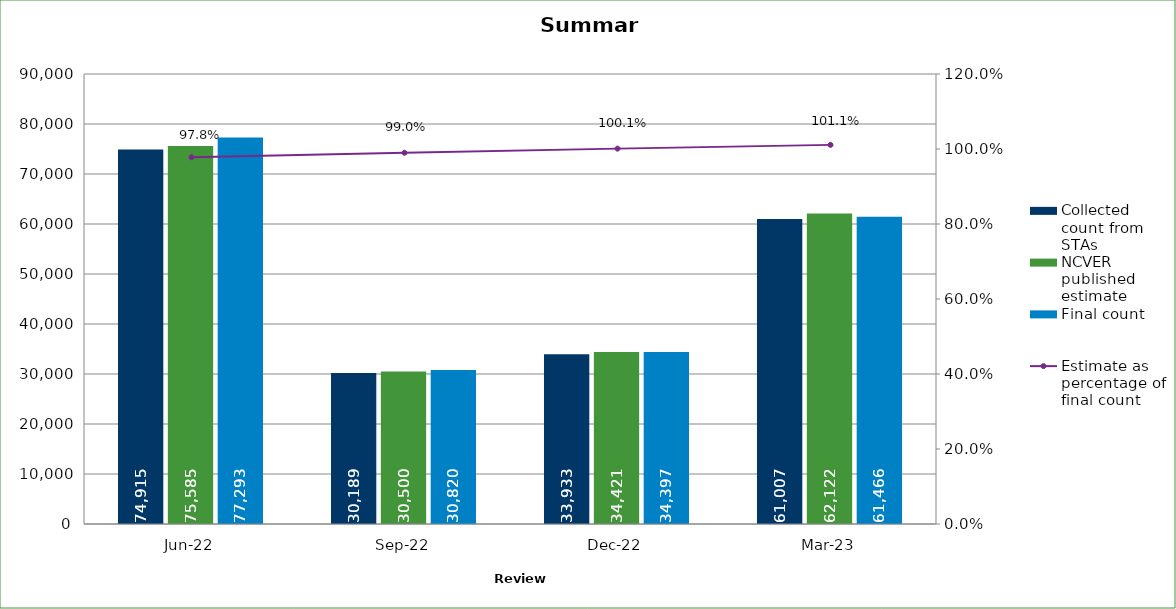
| Category | Collected count from STAs | NCVER published estimate  | Final count |
|---|---|---|---|
| 2022-06-01 | 74915 | 75585 | 77293 |
| 2022-09-01 | 30189 | 30500 | 30820 |
| 2022-12-01 | 33933 | 34421 | 34397 |
| 2023-03-01 | 61007 | 62122 | 61466 |